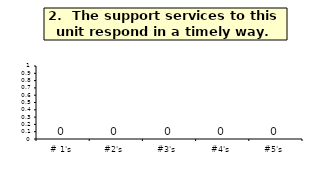
| Category | Q_2 |
|---|---|
| # 1's | 0 |
| #2's | 0 |
| #3's | 0 |
| #4's | 0 |
| #5's | 0 |